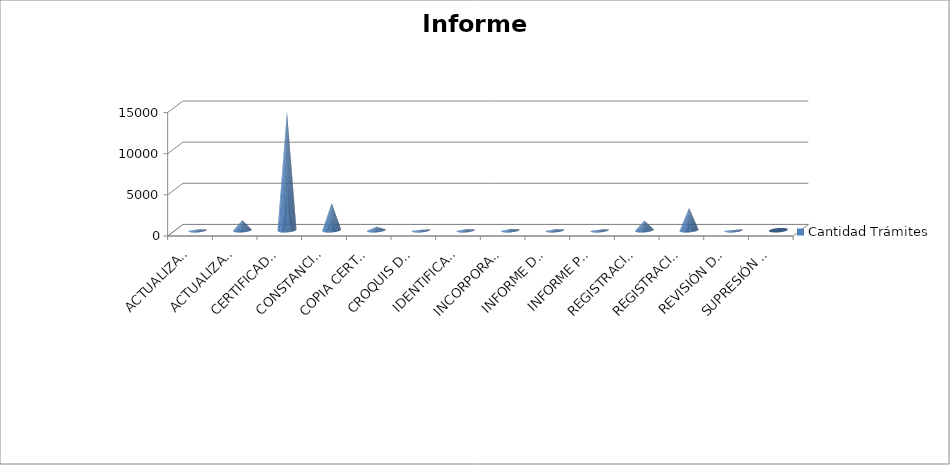
| Category | Cantidad Trámites |
|---|---|
| ACTUALIZACIÓN DE DOMICILIO FISCAL | 84 |
| ACTUALIZACIÓN DE TITULARIDAD DE DOMINIO Y/O RESPONSABLE FISCAL | 1209 |
| CERTIFICADO CATASTRAL  | 14367 |
| CONSTANCIA DE VALUACIÓN E HISTÓRICO | 3293 |
| COPIA CERTIFICADA DE PLANO | 417 |
| CROQUIS DE PARCELA | 44 |
| IDENTIFICACIÓN DE INMUEBLE O PARCELA | 110 |
| INCORPORACIÓN DE OBRA O MEJORAS EDILICIAS  | 165 |
| INFORME DE ANTECEDENTES DE DOMINIO | 109 |
| INFORME PARA APERTURA DE CUENTA TRIBUTARIA ESPECIAL | 68 |
| REGISTRACIÓN DE INFORME DE VERIFICACIÓN | 1154 |
| REGISTRACIÓN DE PLANO DE MENSURA,UNIFICACIÓN, DIVISIÓN, PH, LOTEO, OTRO | 2705 |
| REVISIÓN DE VALUACIÓN | 27 |
| SUPRESIÓN DE MEJORAS | 0 |